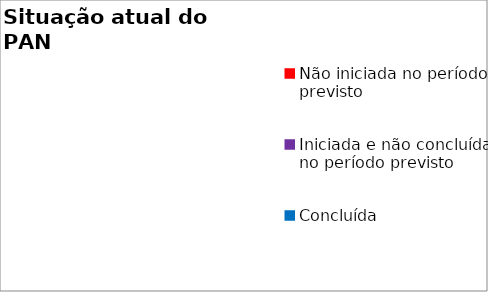
| Category | Series 0 |
|---|---|
| Não iniciada no período previsto | 0 |
| Iniciada e não concluída no período previsto | 0 |
| Concluída | 0 |